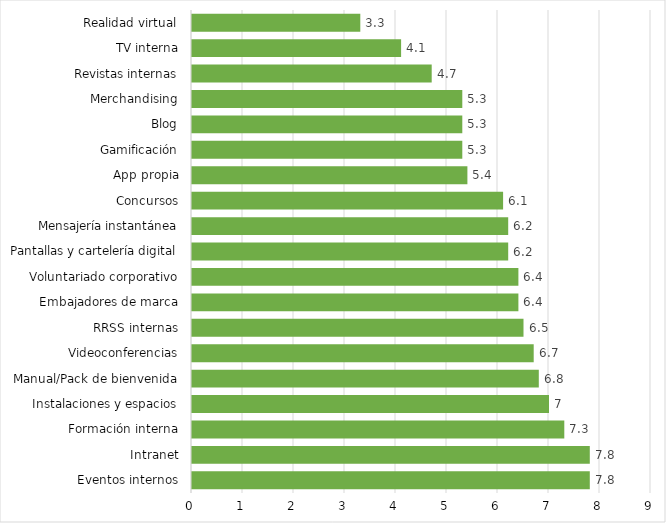
| Category | Series 0 |
|---|---|
| Eventos internos | 7.8 |
| Intranet | 7.8 |
| Formación interna | 7.3 |
| Instalaciones y espacios | 7 |
| Manual/Pack de bienvenida | 6.8 |
| Videoconferencias | 6.7 |
| RRSS internas | 6.5 |
| Embajadores de marca | 6.4 |
| Voluntariado corporativo | 6.4 |
| Pantallas y cartelería digital | 6.2 |
| Mensajería instantánea | 6.2 |
| Concursos | 6.1 |
| App propia | 5.4 |
| Gamificación | 5.3 |
| Blog | 5.3 |
| Merchandising | 5.3 |
| Revistas internas | 4.7 |
| TV interna | 4.1 |
| Realidad virtual | 3.3 |